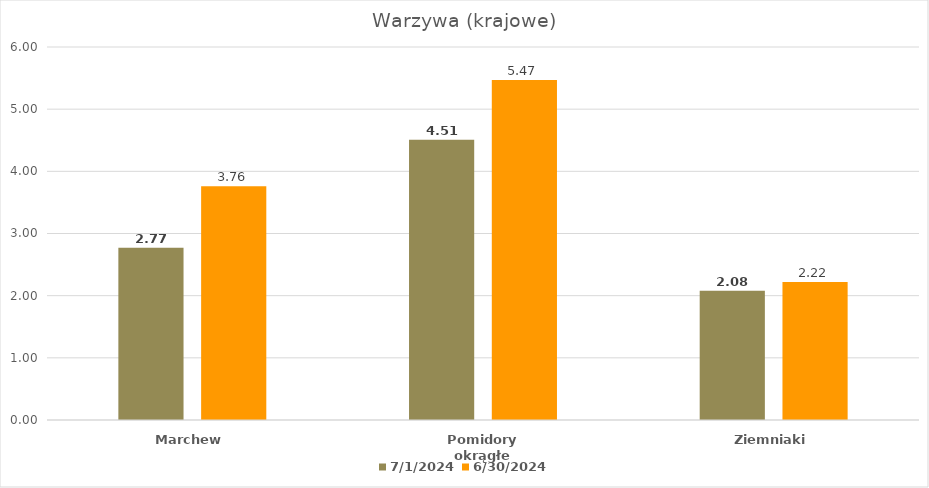
| Category | 2024-07-01 | 2024-06-30 |
|---|---|---|
| Marchew | 2.77 | 3.76 |
| Pomidory okrągłe | 4.51 | 5.47 |
| Ziemniaki | 2.08 | 2.22 |